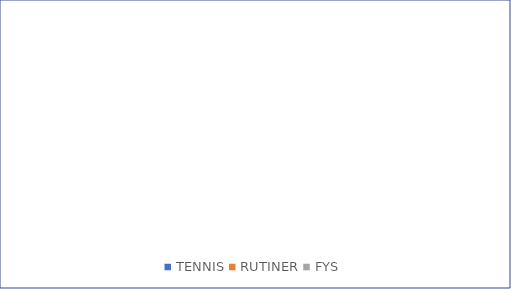
| Category | Series 0 |
|---|---|
| TENNIS | 0 |
| RUTINER | 0 |
| FYS | 0 |